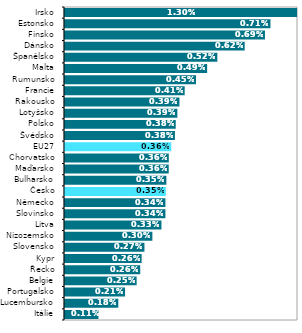
| Category | Series 0 |
|---|---|
| Itálie | 0.001 |
| Lucembursko | 0.002 |
| Portugalsko | 0.002 |
| Belgie | 0.002 |
| Řecko | 0.003 |
| Kypr | 0.003 |
| Slovensko | 0.003 |
| Nizozemsko | 0.003 |
| Litva | 0.003 |
| Slovinsko | 0.003 |
| Německo | 0.003 |
| Česko | 0.003 |
| Bulharsko | 0.003 |
| Maďarsko | 0.004 |
| Chorvatsko | 0.004 |
| EU27 | 0.004 |
| Švédsko | 0.004 |
| Polsko | 0.004 |
| Lotyšsko | 0.004 |
| Rakousko | 0.004 |
| Francie | 0.004 |
| Rumunsko | 0.004 |
| Malta | 0.005 |
| Španělsko | 0.005 |
| Dánsko | 0.006 |
| Finsko | 0.007 |
| Estonsko | 0.007 |
| Irsko | 0.013 |